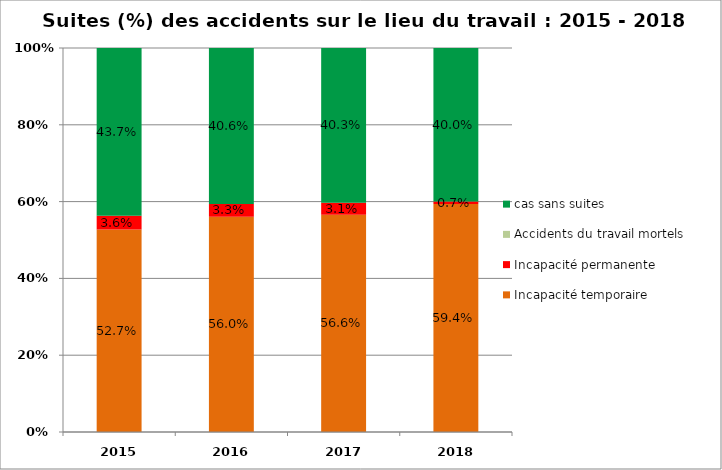
| Category | Incapacité temporaire | Incapacité permanente | Accidents du travail mortels | cas sans suites |
|---|---|---|---|---|
| 0 | 0.527 | 0.036 | 0 | 0.437 |
| 1 | 0.56 | 0.033 | 0 | 0.406 |
| 2 | 0.566 | 0.031 | 0 | 0.403 |
| 3 | 0.594 | 0.007 | 0 | 0.4 |